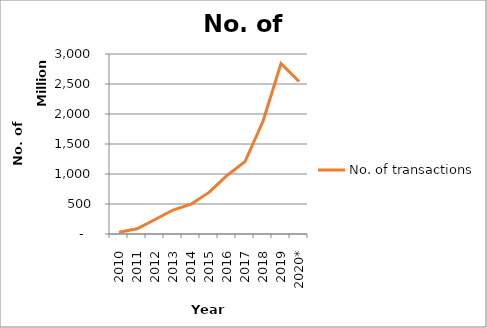
| Category | No. of transactions |
|---|---|
| 2010 | 28815741 |
| 2011 | 87480931 |
| 2012 | 241727989 |
| 2013 | 399460833 |
| 2014 | 496268636 |
| 2015 | 693574008 |
| 2016 | 974746755 |
| 2017 | 1206845135 |
| 2018 | 1878735657 |
| 2019 | 2840934220 |
|  2020* | 2540848903.5 |